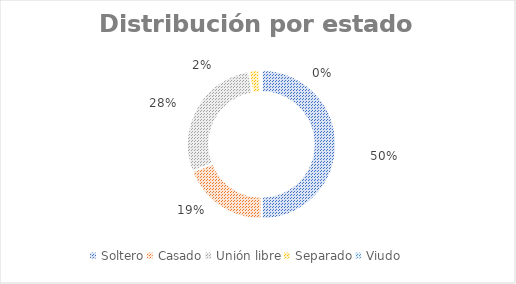
| Category | Series 0 |
|---|---|
| Soltero | 110 |
| Casado | 42 |
| Unión libre | 62 |
| Separado | 5 |
| Viudo | 1 |